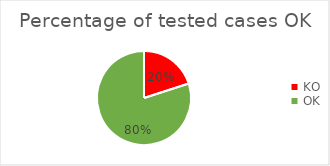
| Category | Series 0 |
|---|---|
| KO | 0.2 |
| OK | 0.8 |